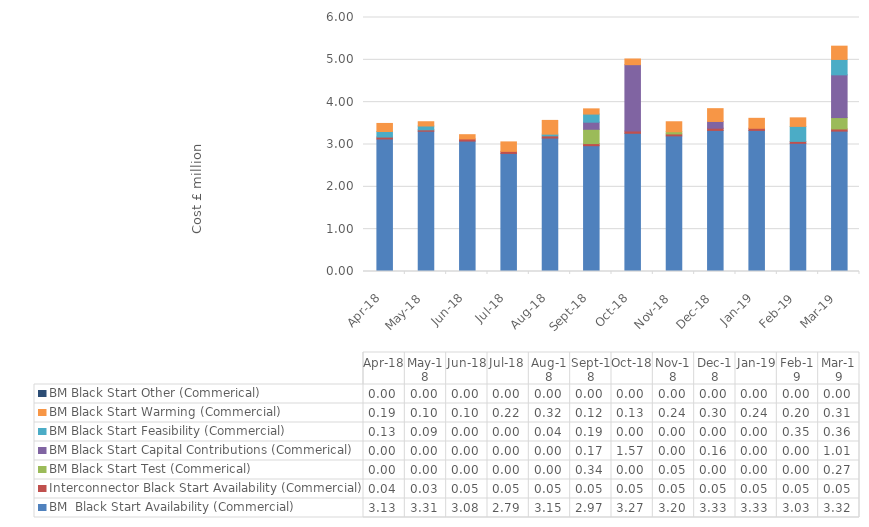
| Category | BM  Black Start Availability (Commercial) | Interconnector Black Start Availability (Commercial) | BM Black Start Test (Commerical) | BM Black Start Capital Contributions (Commerical) | BM Black Start Feasibility (Commercial) | BM Black Start Warming (Commercial) | BM Black Start Other (Commerical) |
|---|---|---|---|---|---|---|---|
| 2018-04-01 | 3.131 | 0.045 | 0 | 0 | 0.131 | 0.19 | 0 |
| 2018-05-01 | 3.314 | 0.032 | 0 | 0 | 0.091 | 0.101 | 0 |
| 2018-06-01 | 3.081 | 0.05 | 0 | 0 | 0 | 0.101 | 0 |
| 2018-07-01 | 2.789 | 0.048 | 0 | 0 | 0 | 0.224 | 0 |
| 2018-08-01 | 3.153 | 0.051 | 0 | 0 | 0.04 | 0.325 | 0 |
| 2018-09-01 | 2.972 | 0.05 | 0.338 | 0.168 | 0.191 | 0.123 | 0 |
| 2018-10-01 | 3.265 | 0.051 | 0 | 1.569 | 0 | 0.134 | 0 |
| 2018-11-01 | 3.204 | 0.046 | 0.052 | 0 | 0 | 0.235 | 0 |
| 2018-12-01 | 3.333 | 0.051 | 0 | 0.159 | 0 | 0.302 | 0 |
| 2019-01-01 | 3.333 | 0.05 | 0 | 0 | 0 | 0.235 | 0 |
| 2019-02-01 | 3.028 | 0.045 | 0 | 0 | 0.354 | 0.202 | 0 |
| 2019-03-01 | 3.316 | 0.05 | 0.269 | 1.01 | 0.364 | 0.314 | 0 |